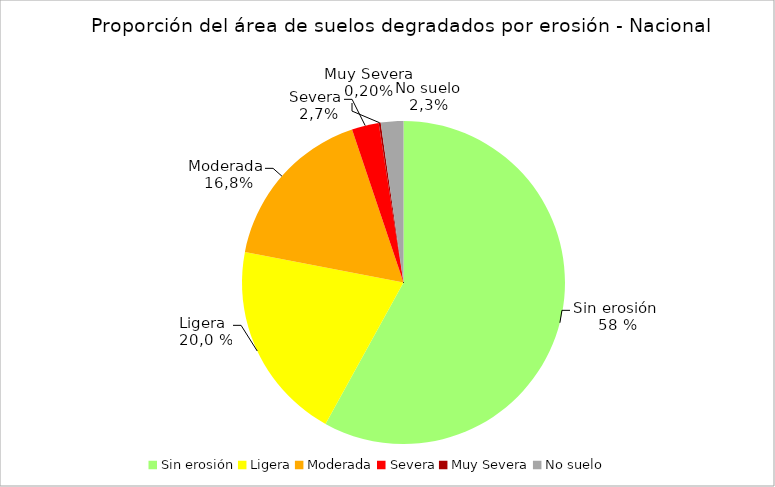
| Category | Series 0 |
|---|---|
| Sin erosión | 58 |
| Ligera | 20 |
| Moderada | 16.8 |
| Severa | 2.7 |
| Muy Severa | 0.2 |
| No suelo | 2.258 |